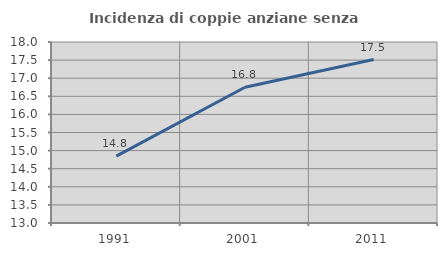
| Category | Incidenza di coppie anziane senza figli  |
|---|---|
| 1991.0 | 14.847 |
| 2001.0 | 16.75 |
| 2011.0 | 17.514 |